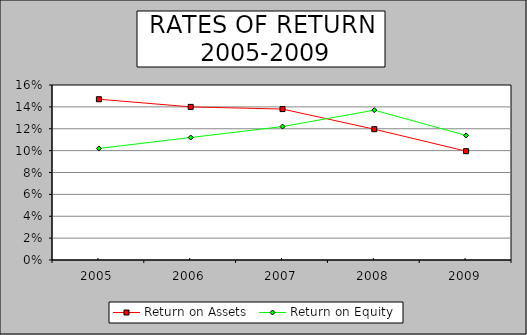
| Category | Return on Assets | Return on Equity |
|---|---|---|
| 2005.0 | 0.147 | 0.102 |
| 2006.0 | 0.14 | 0.112 |
| 2007.0 | 0.138 | 0.122 |
| 2008.0 | 0.12 | 0.137 |
| 2009.0 | 0.1 | 0.114 |